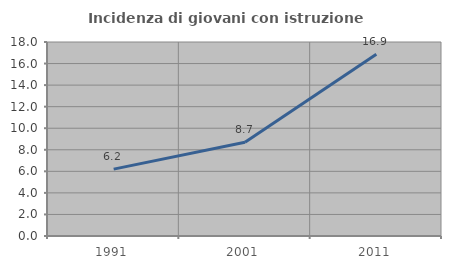
| Category | Incidenza di giovani con istruzione universitaria |
|---|---|
| 1991.0 | 6.206 |
| 2001.0 | 8.699 |
| 2011.0 | 16.872 |